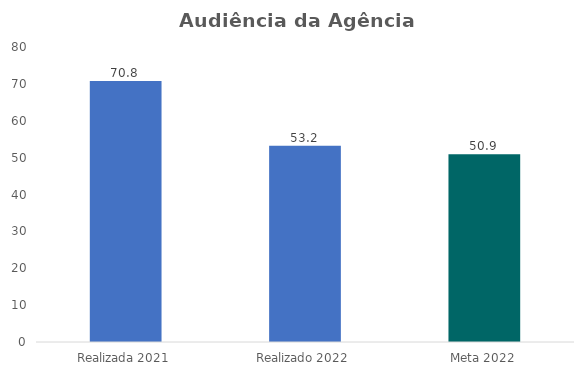
| Category | Series 0 |
|---|---|
| Realizada 2021 | 70.8 |
| Realizado 2022 | 53.2 |
| Meta 2022 | 50.9 |